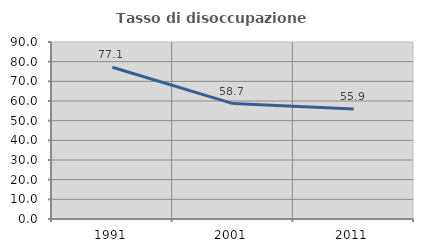
| Category | Tasso di disoccupazione giovanile  |
|---|---|
| 1991.0 | 77.138 |
| 2001.0 | 58.675 |
| 2011.0 | 55.921 |